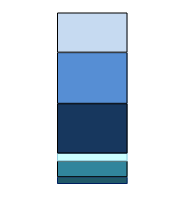
| Category | Series 0 | Series 1 | Series 2 | Series 3 | Series 4 | Series 5 |
|---|---|---|---|---|---|---|
| 0 | 161 | 378 | 183 | 1173 | 1209 | 937 |